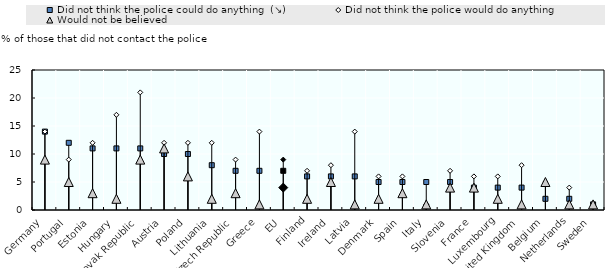
| Category | Did not think the police could do anything  (↘) | Did not think the police would do anything | Would not be believed |
|---|---|---|---|
| Germany | 14 | 14 | 9 |
| Portugal | 12 | 9 | 5 |
| Estonia | 11 | 12 | 3 |
| Hungary | 11 | 17 | 2 |
| Slovak Republic | 11 | 21 | 9 |
| Austria | 10 | 12 | 11 |
| Poland | 10 | 12 | 6 |
| Lithuania | 8 | 12 | 2 |
| Czech Republic | 7 | 9 | 3 |
| Greece | 7 | 14 | 1 |
| EU | 7 | 9 | 4 |
| Finland | 6 | 7 | 2 |
| Ireland | 6 | 8 | 5 |
| Latvia | 6 | 14 | 1 |
| Denmark | 5 | 6 | 2 |
| Spain | 5 | 6 | 3 |
| Italy | 5 | 1 | 1 |
| Slovenia | 5 | 7 | 4 |
| France | 4 | 6 | 4 |
| Luxembourg | 4 | 6 | 2 |
| United Kingdom | 4 | 8 | 1 |
| Belgium | 2 | 5 | 5 |
| Netherlands | 2 | 4 | 1 |
| Sweden | 1 | 1 | 1 |